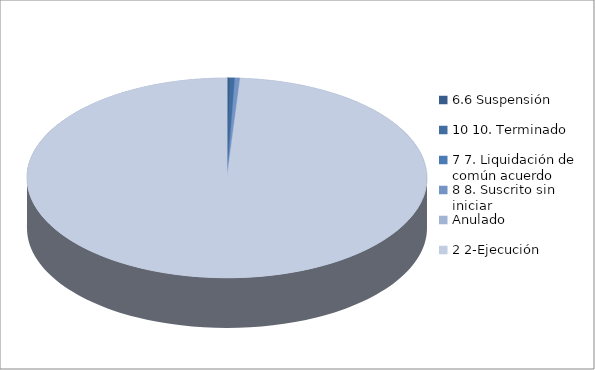
| Category | Series 0 |
|---|---|
| 6.6 Suspensión | 1 |
| 10 10. Terminado | 2 |
| 7 7. Liquidación de común acuerdo | 0 |
| 8 8. Suscrito sin iniciar | 2 |
| Anulado | 0 |
| 2 2-Ejecución | 472 |